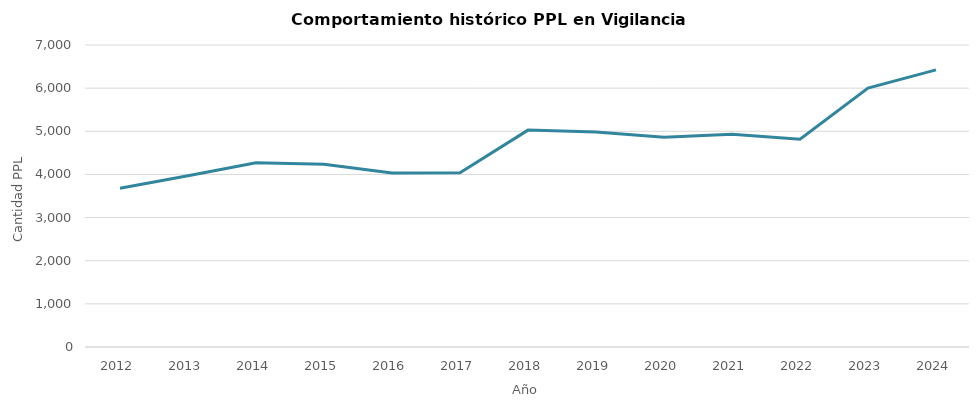
| Category | Promedio anual Vigilancia Electronica |
|---|---|
| 2012.0 | 3681.25 |
| 2013.0 | 3969.167 |
| 2014.0 | 4270.833 |
| 2015.0 | 4235.667 |
| 2016.0 | 4035.917 |
| 2017.0 | 4037.5 |
| 2018.0 | 5027.25 |
| 2019.0 | 4984.25 |
| 2020.0 | 4861 |
| 2021.0 | 4932.083 |
| 2022.0 | 4814.083 |
| 2023.0 | 6001.5 |
| 2024.0 | 6423 |